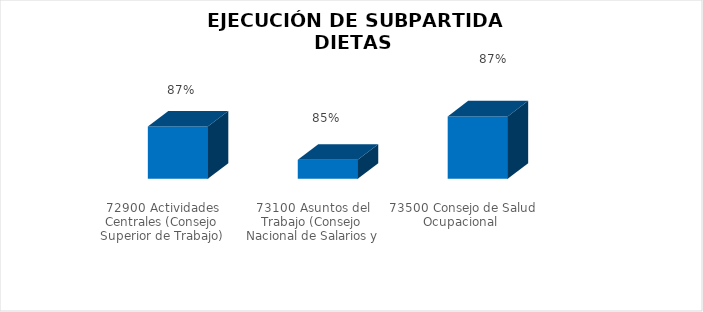
| Category | Series 0 |
|---|---|
| 72900 Actividades Centrales (Consejo Superior de Trabajo) | 0.867 |
| 73100 Asuntos del Trabajo (Consejo Nacional de Salarios y Junta Médica Calificadora) | 0.85 |
| 73500 Consejo de Salud Ocupacional  | 0.872 |